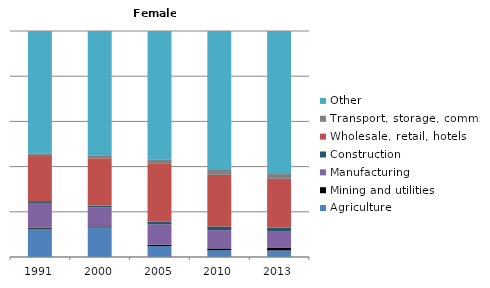
| Category | Agriculture | Mining and utilities | Manufacturing | Construction | Wholesale, retail, hotels | Transport, storage, comms | Other |
|---|---|---|---|---|---|---|---|
| 1991.0 | 12.5 | 0.5 | 10.9 | 0.8 | 19.9 | 1.2 | 54.1 |
| 2000.0 | 13.1 | 0.4 | 8.5 | 0.7 | 20.9 | 1.3 | 54.8 |
| 2005.0 | 4.8 | 0.6 | 9.1 | 1.2 | 25.4 | 1.9 | 56.8 |
| 2010.0 | 3 | 0.8 | 8.1 | 1.6 | 22.8 | 2.2 | 61.4 |
| 2013.0 | 2.9 | 1.1 | 7.2 | 1.7 | 21.7 | 2.1 | 63.3 |